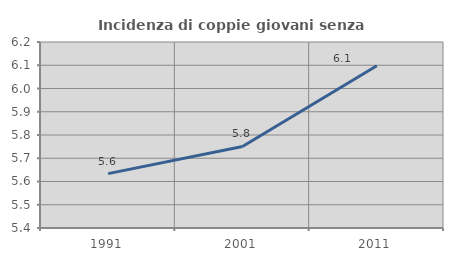
| Category | Incidenza di coppie giovani senza figli |
|---|---|
| 1991.0 | 5.634 |
| 2001.0 | 5.751 |
| 2011.0 | 6.098 |